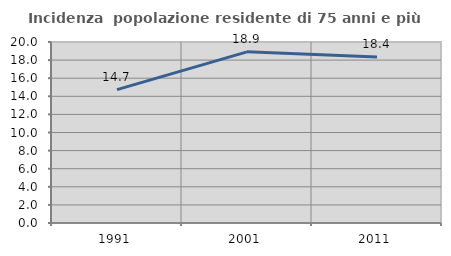
| Category | Incidenza  popolazione residente di 75 anni e più |
|---|---|
| 1991.0 | 14.735 |
| 2001.0 | 18.915 |
| 2011.0 | 18.353 |